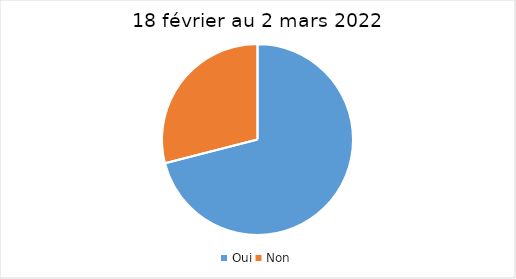
| Category | 18 février au 2 mars 2022 |
|---|---|
| Oui | 71 |
| Non | 29 |